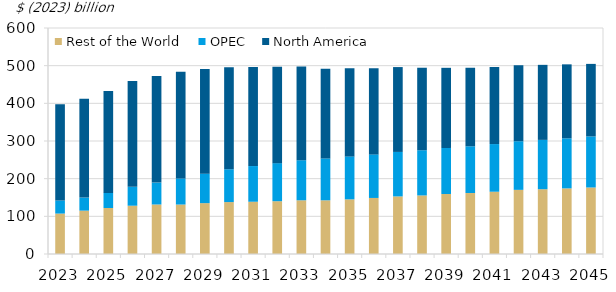
| Category | Rest of the World | OPEC | North America |
|---|---|---|---|
| 2023.0 | 107.323 | 34.797 | 255.458 |
| 2024.0 | 115.105 | 34.797 | 262.243 |
| 2025.0 | 122.097 | 40.166 | 270.331 |
| 2026.0 | 128.204 | 50.174 | 280.593 |
| 2027.0 | 131.434 | 58.21 | 282.905 |
| 2028.0 | 131.31 | 69.418 | 282.828 |
| 2029.0 | 135.048 | 78.312 | 277.859 |
| 2030.0 | 137.835 | 87.165 | 270.517 |
| 2031.0 | 138.74 | 94.756 | 262.889 |
| 2032.0 | 140.162 | 101.03 | 255.67 |
| 2033.0 | 142.612 | 106.345 | 248.554 |
| 2034.0 | 142.544 | 111.167 | 238.135 |
| 2035.0 | 145.075 | 114.096 | 233.783 |
| 2036.0 | 148.793 | 115.677 | 228.703 |
| 2037.0 | 152.89 | 118.107 | 225.273 |
| 2038.0 | 155.457 | 120.037 | 219.015 |
| 2039.0 | 159.322 | 122.166 | 212.805 |
| 2040.0 | 161.87 | 124.072 | 208.514 |
| 2041.0 | 165.312 | 126.527 | 204.61 |
| 2042.0 | 170.305 | 129.098 | 201.752 |
| 2043.0 | 171.984 | 130.981 | 199.2 |
| 2044.0 | 174.203 | 132.871 | 196.413 |
| 2045.0 | 176.578 | 135.581 | 192.562 |